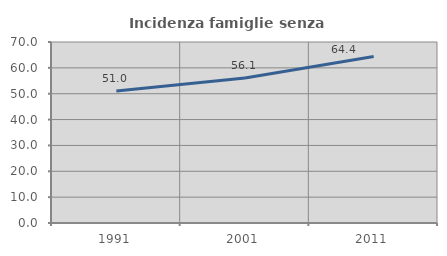
| Category | Incidenza famiglie senza nuclei |
|---|---|
| 1991.0 | 51.007 |
| 2001.0 | 56.098 |
| 2011.0 | 64.423 |